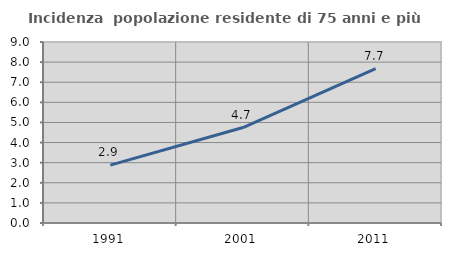
| Category | Incidenza  popolazione residente di 75 anni e più |
|---|---|
| 1991.0 | 2.88 |
| 2001.0 | 4.746 |
| 2011.0 | 7.671 |